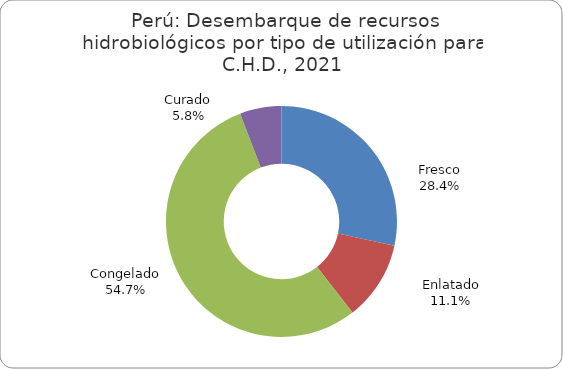
| Category | Series 0 |
|---|---|
| Fresco | 395143.743 |
| Enlatado | 154610.07 |
| Congelado | 762237.863 |
| Curado | 81178.27 |